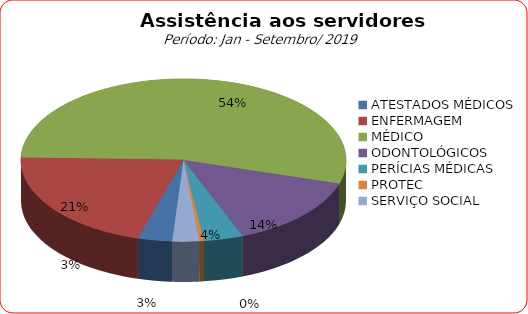
| Category | Series 0 |
|---|---|
| ATESTADOS MÉDICOS | 3.412 |
| ENFERMAGEM | 20.883 |
| MÉDICO | 54.271 |
| ODONTOLÓGICOS | 14.426 |
| PERÍCIAS MÉDICAS | 3.903 |
| PROTEC | 0.45 |
| SERVIÇO SOCIAL | 2.656 |